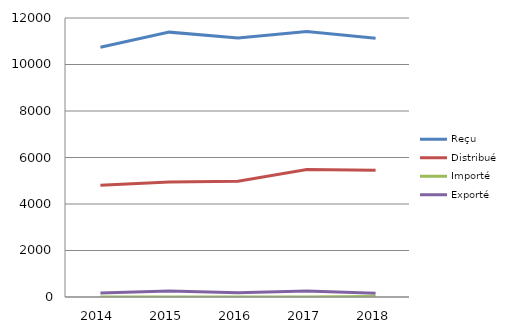
| Category | Reçu | Distribué | Importé | Exporté |
|---|---|---|---|---|
| 2014.0 | 10742 | 4804 | 0 | 175 |
| 2015.0 | 11392 | 4941 | 0 | 254 |
| 2016.0 | 11136 | 4979 | 0 | 178 |
| 2017.0 | 11422 | 5481 | 0 | 256 |
| 2018.0 | 11133 | 5448 | 24 | 158 |